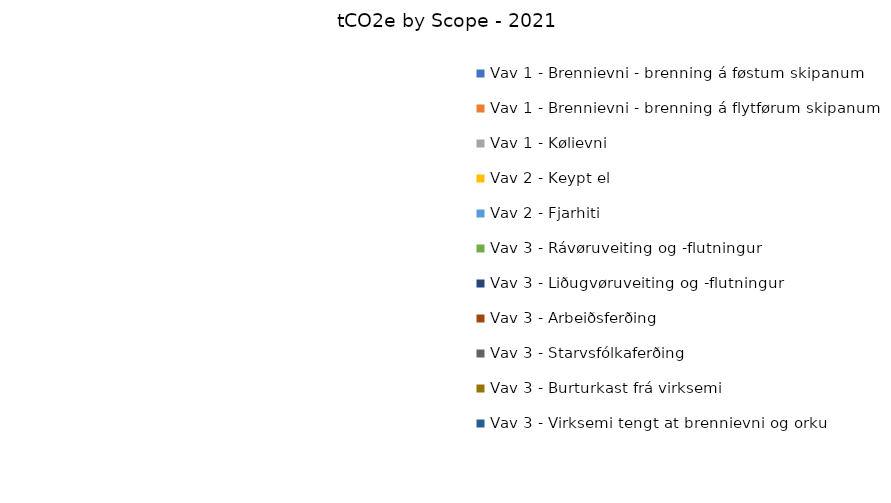
| Category |  tCO2e by Scope - 2021 |
|---|---|
| Vav 1 - Brennievni - brenning á føstum skipanum | 0 |
| Vav 1 - Brennievni - brenning á flytførum skipanum | 0 |
| Vav 1 - Kølievni | 0 |
| Vav 2 - Keypt el | 0 |
| Vav 2 - Fjarhiti | 0 |
| Vav 3 - Rávøruveiting og -flutningur | 0 |
| Vav 3 - Liðugvøruveiting og -flutningur | 0 |
| Vav 3 - Arbeiðsferðing | 0 |
| Vav 3 - Starvsfólkaferðing | 0 |
| Vav 3 - Burturkast frá virksemi | 0 |
| Vav 3 - Virksemi tengt at brennievni og orku | 0 |